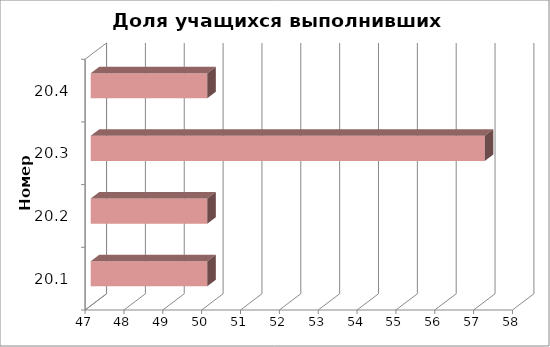
| Category | Доля учащихся выполнивших критерий |
|---|---|
| 20.1 | 50 |
| 20.2 | 50 |
| 20.3 | 57.143 |
| 20.4 | 50 |